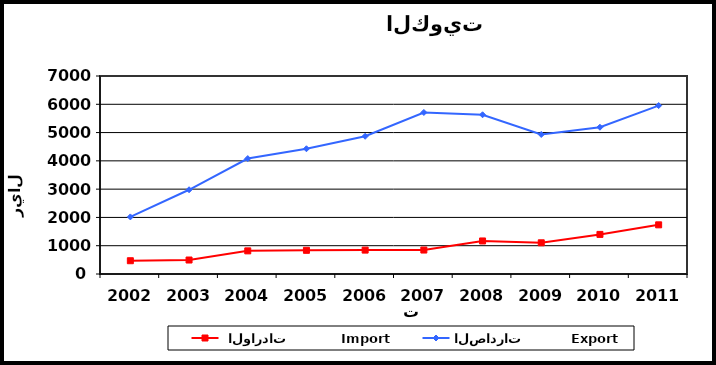
| Category |  الواردات           Import | الصادرات          Export |
|---|---|---|
| 2002.0 | 469 | 2018 |
| 2003.0 | 494 | 2978 |
| 2004.0 | 818 | 4081 |
| 2005.0 | 837 | 4428 |
| 2006.0 | 845 | 4869 |
| 2007.0 | 847 | 5711 |
| 2008.0 | 1168 | 5629 |
| 2009.0 | 1103 | 4932 |
| 2010.0 | 1400 | 5189 |
| 2011.0 | 1738 | 5954 |